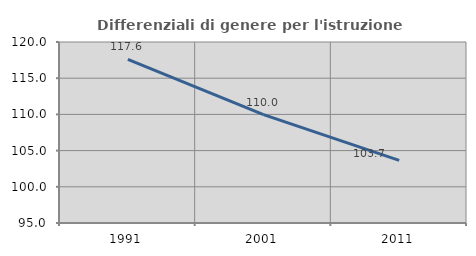
| Category | Differenziali di genere per l'istruzione superiore |
|---|---|
| 1991.0 | 117.607 |
| 2001.0 | 109.979 |
| 2011.0 | 103.657 |